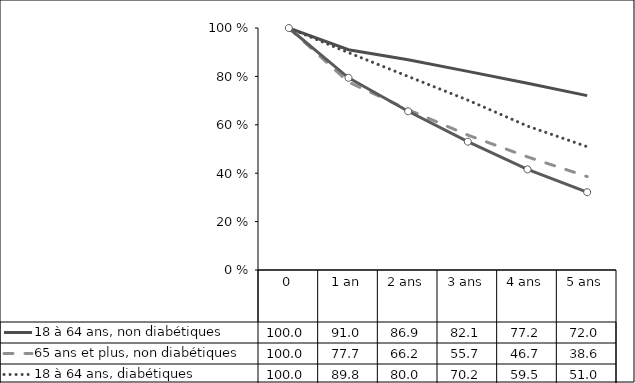
| Category | 18 à 64 ans, non diabétiques | 65 ans et plus, non diabétiques    | 18 à 64 ans, diabétiques | 65 ans et plus, diabétiques |
|---|---|---|---|---|
| 0 | 100 | 100 | 100 | 100 |
| 1 an | 91.006 | 77.662 | 89.804 | 79.422 |
| 2 ans | 86.866 | 66.247 | 79.982 | 65.581 |
| 3 ans | 82.077 | 55.75 | 70.199 | 53.018 |
| 4 ans | 77.197 | 46.746 | 59.483 | 41.581 |
| 5 ans | 72.048 | 38.61 | 50.958 | 32.148 |